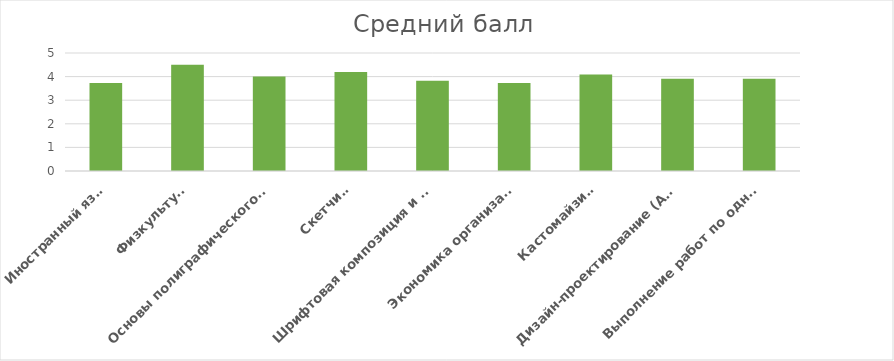
| Category | Средний балл |
|---|---|
| Иностранный язык | 3.73 |
| Физкультура | 4.5 |
| Основы полиграфического дизайна | 4 |
| Скетчинг | 4.19 |
| Шрифтовая композиция и оформительская графика | 3.82 |
| Экономика организации | 3.73 |
| Кастомайзинг | 4.09 |
| Дизайн-проектирование (Анимация) | 3.91 |
| Выполнение работ по одной или нескольким профессиям рабочих, должностям служащих | 3.91 |